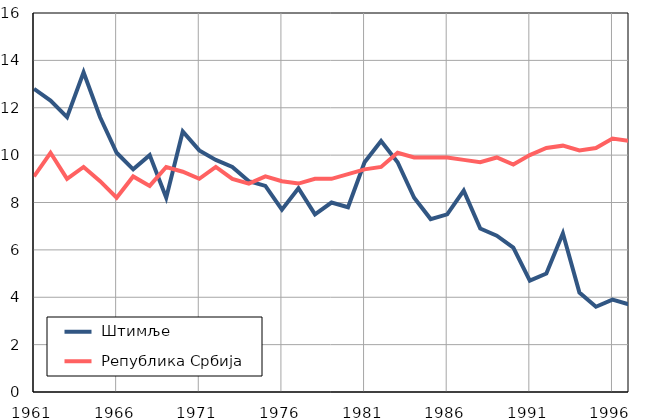
| Category |  Штимље |  Република Србија |
|---|---|---|
| 1961.0 | 12.8 | 9.1 |
| 1962.0 | 12.3 | 10.1 |
| 1963.0 | 11.6 | 9 |
| 1964.0 | 13.5 | 9.5 |
| 1965.0 | 11.6 | 8.9 |
| 1966.0 | 10.1 | 8.2 |
| 1967.0 | 9.4 | 9.1 |
| 1968.0 | 10 | 8.7 |
| 1969.0 | 8.2 | 9.5 |
| 1970.0 | 11 | 9.3 |
| 1971.0 | 10.2 | 9 |
| 1972.0 | 9.8 | 9.5 |
| 1973.0 | 9.5 | 9 |
| 1974.0 | 8.9 | 8.8 |
| 1975.0 | 8.7 | 9.1 |
| 1976.0 | 7.7 | 8.9 |
| 1977.0 | 8.6 | 8.8 |
| 1978.0 | 7.5 | 9 |
| 1979.0 | 8 | 9 |
| 1980.0 | 7.8 | 9.2 |
| 1981.0 | 9.7 | 9.4 |
| 1982.0 | 10.6 | 9.5 |
| 1983.0 | 9.7 | 10.1 |
| 1984.0 | 8.2 | 9.9 |
| 1985.0 | 7.3 | 9.9 |
| 1986.0 | 7.5 | 9.9 |
| 1987.0 | 8.5 | 9.8 |
| 1988.0 | 6.9 | 9.7 |
| 1989.0 | 6.6 | 9.9 |
| 1990.0 | 6.1 | 9.6 |
| 1991.0 | 4.7 | 10 |
| 1992.0 | 5 | 10.3 |
| 1993.0 | 6.7 | 10.4 |
| 1994.0 | 4.2 | 10.2 |
| 1995.0 | 3.6 | 10.3 |
| 1996.0 | 3.9 | 10.7 |
| 1997.0 | 3.7 | 10.6 |